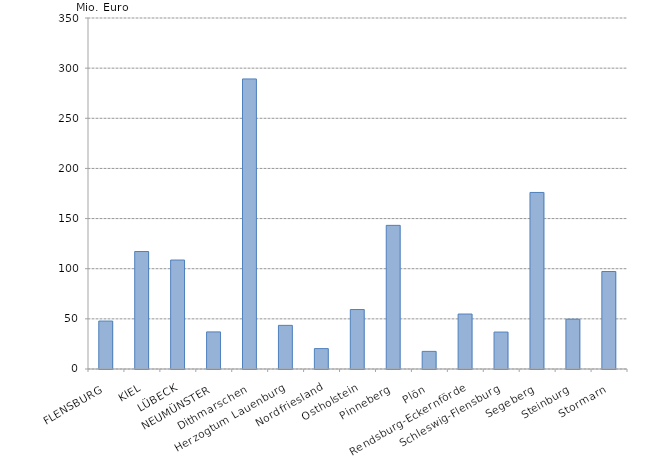
| Category | Series 0 |
|---|---|
| FLENSBURG | 47809.139 |
| KIEL | 117137.716 |
| LÜBECK | 108652.154 |
| NEUMÜNSTER | 36977.013 |
| Dithmarschen | 289235.653 |
| Herzogtum Lauenburg | 43505.534 |
| Nordfriesland | 20333.749 |
| Ostholstein | 59296.615 |
| Pinneberg | 143228.181 |
| Plön | 17565.183 |
| Rendsburg-Eckernförde | 54808.485 |
| Schleswig-Flensburg | 36817.947 |
| Segeberg | 176037.342 |
| Steinburg | 49673.386 |
| Stormarn | 97220.872 |